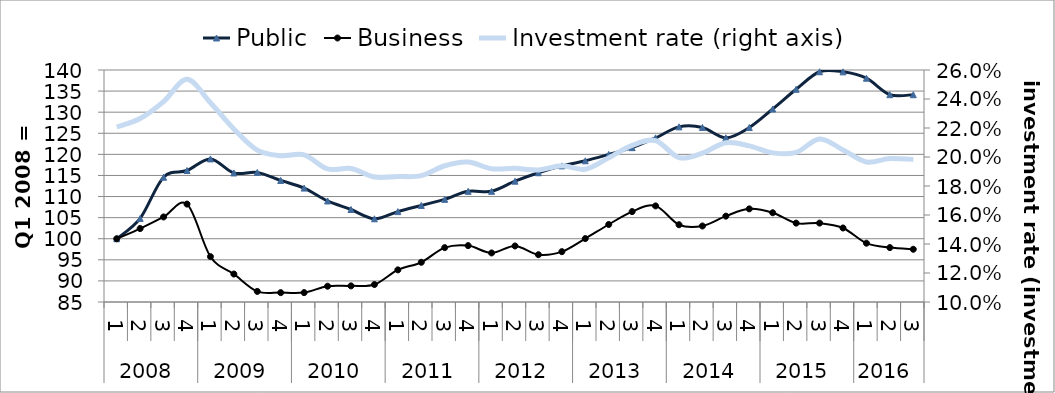
| Category | Public | Business |
|---|---|---|
| 0 | 100 | 100 |
| 1 | 104.817 | 102.414 |
| 2 | 114.579 | 105.164 |
| 3 | 116.17 | 108.211 |
| 4 | 118.919 | 95.759 |
| 5 | 115.59 | 91.628 |
| 6 | 115.718 | 87.509 |
| 7 | 113.815 | 87.223 |
| 8 | 112.005 | 87.227 |
| 9 | 108.959 | 88.742 |
| 10 | 106.926 | 88.817 |
| 11 | 104.726 | 89.141 |
| 12 | 106.428 | 92.619 |
| 13 | 107.891 | 94.414 |
| 14 | 109.334 | 97.887 |
| 15 | 111.24 | 98.371 |
| 16 | 111.242 | 96.631 |
| 17 | 113.647 | 98.281 |
| 18 | 115.64 | 96.217 |
| 19 | 117.274 | 96.933 |
| 20 | 118.474 | 100.033 |
| 21 | 119.984 | 103.374 |
| 22 | 121.592 | 106.434 |
| 23 | 123.912 | 107.78 |
| 24 | 126.523 | 103.324 |
| 25 | 126.38 | 103.02 |
| 26 | 123.922 | 105.354 |
| 27 | 126.363 | 107.079 |
| 28 | 130.755 | 106.161 |
| 29 | 135.428 | 103.7 |
| 30 | 139.58 | 103.707 |
| 31 | 139.562 | 102.545 |
| 32 | 138.053 | 98.94 |
| 33 | 134.145 | 97.899 |
| 34 | 134.141 | 97.5 |